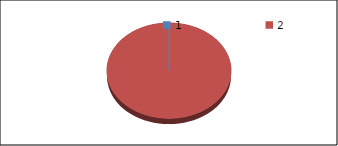
| Category | Series1 |
|---|---|
| 0 | 0 |
| 1 | 40.4 |